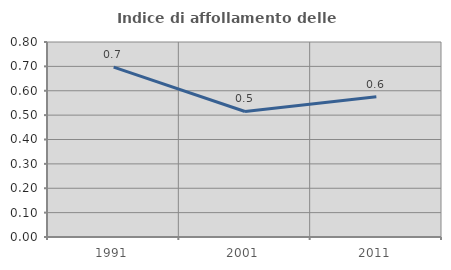
| Category | Indice di affollamento delle abitazioni  |
|---|---|
| 1991.0 | 0.697 |
| 2001.0 | 0.515 |
| 2011.0 | 0.575 |